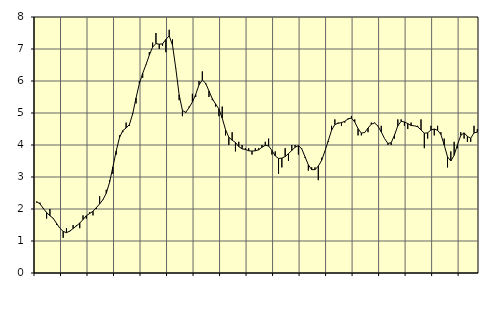
| Category | Piggar | Series 1 |
|---|---|---|
| nan | 2.2 | 2.23 |
| 87.0 | 2.2 | 2.16 |
| 87.0 | 2 | 2.02 |
| 87.0 | 1.7 | 1.89 |
| nan | 2 | 1.79 |
| 88.0 | 1.7 | 1.71 |
| 88.0 | 1.5 | 1.55 |
| 88.0 | 1.4 | 1.4 |
| nan | 1.1 | 1.3 |
| 89.0 | 1.4 | 1.26 |
| 89.0 | 1.3 | 1.31 |
| 89.0 | 1.5 | 1.39 |
| nan | 1.5 | 1.47 |
| 90.0 | 1.4 | 1.56 |
| 90.0 | 1.8 | 1.67 |
| 90.0 | 1.7 | 1.79 |
| nan | 1.9 | 1.86 |
| 91.0 | 1.8 | 1.93 |
| 91.0 | 2 | 2.04 |
| 91.0 | 2.4 | 2.16 |
| nan | 2.3 | 2.29 |
| 92.0 | 2.6 | 2.49 |
| 92.0 | 2.9 | 2.83 |
| 92.0 | 3.1 | 3.31 |
| nan | 3.7 | 3.81 |
| 93.0 | 4.3 | 4.23 |
| 93.0 | 4.4 | 4.45 |
| 93.0 | 4.7 | 4.53 |
| nan | 4.6 | 4.64 |
| 94.0 | 5 | 4.98 |
| 94.0 | 5.3 | 5.47 |
| 94.0 | 6 | 5.92 |
| nan | 6.1 | 6.24 |
| 95.0 | 6.5 | 6.51 |
| 95.0 | 6.9 | 6.81 |
| 95.0 | 7.2 | 7.06 |
| nan | 7.5 | 7.17 |
| 96.0 | 7 | 7.15 |
| 96.0 | 7.1 | 7.16 |
| 96.0 | 6.9 | 7.3 |
| nan | 7.6 | 7.41 |
| 97.0 | 7.3 | 7.12 |
| 97.0 | 6.4 | 6.39 |
| 97.0 | 5.4 | 5.57 |
| nan | 4.9 | 5.08 |
| 98.0 | 5 | 5.02 |
| 98.0 | 5.2 | 5.17 |
| 98.0 | 5.6 | 5.34 |
| nan | 5.5 | 5.58 |
| 99.0 | 6 | 5.88 |
| 99.0 | 6.3 | 6.03 |
| 99.0 | 5.9 | 5.93 |
| nan | 5.5 | 5.69 |
| 0.0 | 5.4 | 5.45 |
| 0.0 | 5.2 | 5.28 |
| 0.0 | 4.9 | 5.13 |
| nan | 5.2 | 4.84 |
| 1.0 | 4.3 | 4.48 |
| 1.0 | 4 | 4.24 |
| 1.0 | 4.4 | 4.15 |
| nan | 3.8 | 4.08 |
| 2.0 | 4.1 | 3.95 |
| 2.0 | 4 | 3.88 |
| 2.0 | 3.9 | 3.86 |
| nan | 3.9 | 3.82 |
| 3.0 | 3.7 | 3.81 |
| 3.0 | 3.9 | 3.82 |
| 3.0 | 3.9 | 3.85 |
| nan | 4 | 3.93 |
| 4.0 | 4.1 | 3.99 |
| 4.0 | 4.2 | 3.97 |
| 4.0 | 3.7 | 3.83 |
| nan | 3.8 | 3.66 |
| 5.0 | 3.1 | 3.58 |
| 5.0 | 3.3 | 3.59 |
| 5.0 | 3.9 | 3.64 |
| nan | 3.5 | 3.73 |
| 6.0 | 4 | 3.83 |
| 6.0 | 4 | 3.93 |
| 6.0 | 3.7 | 3.98 |
| nan | 3.9 | 3.88 |
| 7.0 | 3.6 | 3.63 |
| 7.0 | 3.2 | 3.38 |
| 7.0 | 3.3 | 3.23 |
| nan | 3.3 | 3.23 |
| 8.0 | 2.9 | 3.34 |
| 8.0 | 3.6 | 3.52 |
| 8.0 | 3.8 | 3.81 |
| nan | 4.1 | 4.13 |
| 9.0 | 4.6 | 4.46 |
| 9.0 | 4.8 | 4.64 |
| 9.0 | 4.7 | 4.68 |
| nan | 4.6 | 4.7 |
| 10.0 | 4.7 | 4.74 |
| 10.0 | 4.8 | 4.82 |
| 10.0 | 4.9 | 4.84 |
| nan | 4.8 | 4.72 |
| 11.0 | 4.3 | 4.51 |
| 11.0 | 4.3 | 4.37 |
| 11.0 | 4.4 | 4.39 |
| nan | 4.4 | 4.53 |
| 12.0 | 4.7 | 4.65 |
| 12.0 | 4.7 | 4.69 |
| 12.0 | 4.6 | 4.59 |
| nan | 4.6 | 4.41 |
| 13.0 | 4.2 | 4.2 |
| 13.0 | 4 | 4.05 |
| 13.0 | 4 | 4.07 |
| nan | 4.2 | 4.31 |
| 14.0 | 4.8 | 4.6 |
| 14.0 | 4.8 | 4.74 |
| 14.0 | 4.6 | 4.72 |
| nan | 4.5 | 4.67 |
| 15.0 | 4.7 | 4.61 |
| 15.0 | 4.6 | 4.6 |
| 15.0 | 4.6 | 4.57 |
| nan | 4.8 | 4.47 |
| 16.0 | 3.9 | 4.37 |
| 16.0 | 4.2 | 4.38 |
| 16.0 | 4.6 | 4.47 |
| nan | 4.3 | 4.5 |
| 17.0 | 4.6 | 4.46 |
| 17.0 | 4.4 | 4.33 |
| 17.0 | 4.2 | 4 |
| nan | 3.3 | 3.63 |
| 18.0 | 3.8 | 3.5 |
| 18.0 | 4.1 | 3.68 |
| 18.0 | 3.9 | 4.01 |
| nan | 4.4 | 4.3 |
| 19.0 | 4.2 | 4.38 |
| 19.0 | 4.1 | 4.27 |
| 19.0 | 4.1 | 4.21 |
| nan | 4.6 | 4.38 |
| 20.0 | 4.5 | 4.4 |